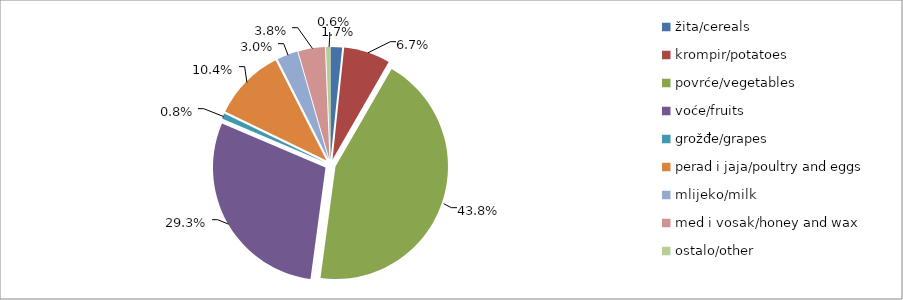
| Category | Series 0 |
|---|---|
| žita/cereals | 28499 |
| krompir/potatoes | 114416 |
| povrće/vegetables | 752794.4 |
| voće/fruits | 502803.5 |
| grožđe/grapes | 13237 |
| perad i jaja/poultry and eggs | 178120.3 |
| mlijeko/milk | 51483 |
| med i vosak/honey and wax | 65695 |
| ostalo/other | 11150 |